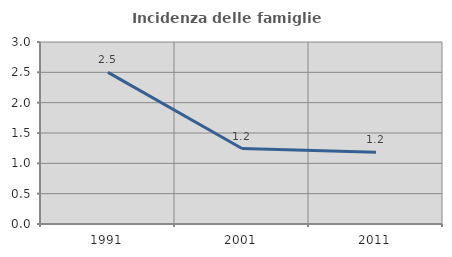
| Category | Incidenza delle famiglie numerose |
|---|---|
| 1991.0 | 2.5 |
| 2001.0 | 1.244 |
| 2011.0 | 1.181 |